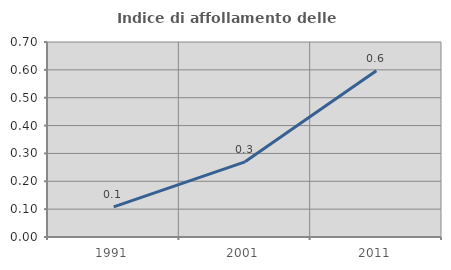
| Category | Indice di affollamento delle abitazioni  |
|---|---|
| 1991.0 | 0.108 |
| 2001.0 | 0.27 |
| 2011.0 | 0.596 |